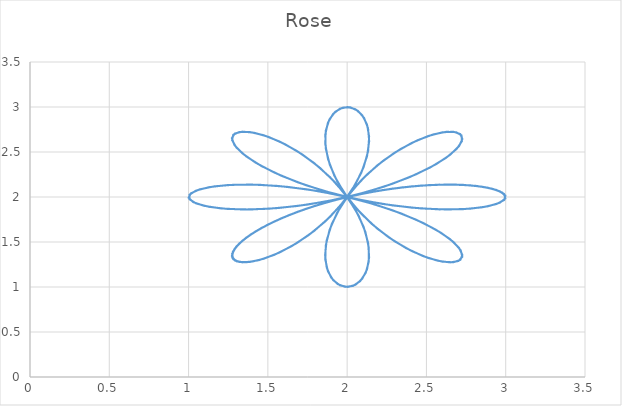
| Category | Series 0 |
|---|---|
| 3.0 | 2 |
| 2.9788417498233435 | 2.049 |
| 2.9164595255079897 | 2.092 |
| 2.8160679856132487 | 2.123 |
| 2.682818960388909 | 2.138 |
| 2.523505615634545 | 2.134 |
| 2.3461735849691836 | 2.107 |
| 2.1596624961211175 | 2.058 |
| 1.9731054589647656 | 1.989 |
| 1.7954165321851514 | 1.901 |
| 1.6347967930603848 | 1.8 |
| 1.4982883662804014 | 1.692 |
| 1.3914027043532338 | 1.584 |
| 1.3178447462840834 | 1.481 |
| 1.279348604054673 | 1.393 |
| 1.2756335099688503 | 1.325 |
| 1.3044813317975716 | 1.284 |
| 1.3619294874254928 | 1.274 |
| 1.44256602927608 | 1.298 |
| 1.5399074576674439 | 1.357 |
| 1.646834844431391 | 1.45 |
| 1.7560604093852499 | 1.575 |
| 1.860595002191198 | 1.726 |
| 1.9541871012836087 | 1.898 |
| 2.03170593515811 | 2.082 |
| 2.08944503044247 | 2.269 |
| 2.1253276607639418 | 2.451 |
| 2.139001984081751 | 2.619 |
| 2.131820716501302 | 2.764 |
| 2.1067075541202813 | 2.879 |
| 2.0679197592021223 | 2.958 |
| 2.0207229213061297 | 2.996 |
| 1.9709994748154158 | 2.993 |
| 1.924816752751114 | 2.947 |
| 1.8879829200140779 | 2.862 |
| 1.8656198968180455 | 2.742 |
| 1.8617813070289788 | 2.592 |
| 1.8791406337495438 | 2.422 |
| 1.9187703143213917 | 2.238 |
| 1.9800267375602116 | 2.05 |
| 2.060549378786958 | 1.868 |
| 2.156375044547313 | 1.699 |
| 2.2621608541937124 | 1.552 |
| 2.371502620615742 | 1.432 |
| 2.4773291449732904 | 1.344 |
| 2.5723479973804153 | 1.291 |
| 2.6495149294391815 | 1.273 |
| 2.7024973733976734 | 1.289 |
| 2.7261026366323735 | 1.335 |
| 2.716643394361806 | 1.407 |
| 2.6722167985068044 | 1.498 |
| 2.5928787295622704 | 1.602 |
| 2.480701101006426 | 1.711 |
| 2.3397072883763994 | 1.818 |
| 2.175688254787056 | 1.917 |
| 1.9959093168225424 | 2.002 |
| 1.8087242820455816 | 2.068 |
| 1.6231194701182894 | 2.113 |
| 1.4482145438069556 | 2.136 |
| 1.292749848263064 | 2.137 |
| 1.164590912628257 | 2.119 |
| 1.0702798451607412 | 2.085 |
| 1.0146606058642584 | 2.041 |
| 1.0006007360450402 | 1.992 |
| 1.028826331941241 | 1.943 |
| 1.097880225096576 | 1.902 |
| 1.2042058949359535 | 1.873 |
| 1.3423520464434504 | 1.861 |
| 1.5052855049605876 | 1.869 |
| 1.6847935586313398 | 1.9 |
| 1.8719515176077166 | 1.952 |
| 2.0576273866509456 | 2.025 |
| 2.2329934008943564 | 2.115 |
| 2.3900138831487436 | 2.217 |
| 2.5218804603069644 | 2.326 |
| 2.6233690255540574 | 2.434 |
| 2.6910977422672744 | 2.535 |
| 2.723671548486467 | 2.62 |
| 2.7217056542339124 | 2.684 |
| 2.6877279909877774 | 2.72 |
| 2.6259680102729512 | 2.725 |
| 2.54204617617705 | 2.695 |
| 2.4425845253040483 | 2.63 |
| 2.334763405678992 | 2.531 |
| 2.225852662638383 | 2.402 |
| 2.1227469227877513 | 2.246 |
| 2.0315341553092803 | 2.072 |
| 1.9571243974658106 | 1.887 |
| 1.9029615656229133 | 1.7 |
| 1.870835886103909 | 1.519 |
| 1.8608080116081882 | 1.355 |
| 1.8712487457192872 | 1.214 |
| 1.8989909288078193 | 1.105 |
| 1.9395829056490326 | 1.033 |
| 1.987626545398194 | 1.001 |
| 2.037177422214095 | 1.012 |
| 2.0821808255616134 | 1.064 |
| 2.1169149996536305 | 1.156 |
| 2.1364125536615663 | 1.281 |
| 2.1368323668857796 | 1.435 |
| 2.1157574495023326 | 1.609 |
| 2.072398913470873 | 1.794 |
| 2.0076921658248295 | 1.981 |
| 1.9242782847572402 | 2.162 |
| 1.8263708485724341 | 2.327 |
| 1.7195158003787585 | 2.47 |
| 1.6102587883904222 | 2.585 |
| 1.5057403919157892 | 2.667 |
| 1.4132443504519836 | 2.714 |
| 1.339727060079642 | 2.727 |
| 1.2913579868588185 | 2.706 |
| 1.2731001800646227 | 2.655 |
| 1.2883577731375273 | 2.579 |
| 1.3387133753958236 | 2.485 |
| 1.4237728265780878 | 2.38 |
| 1.5411282432755748 | 2.271 |
| 1.686443035119698 | 2.165 |
| 1.8536550577252398 | 2.068 |
| 2.0352867642138643 | 1.986 |
| 2.2228445709571187 | 1.923 |
| 2.4072840790657843 | 1.881 |
| 2.5795136382954236 | 1.862 |
| 2.730906264118577 | 1.865 |
| 2.853789277738519 | 1.886 |
| 2.941882275371771 | 1.921 |
| 2.9906570736594285 | 1.967 |
| 2.997597937400317 | 2.017 |
| 2.9623463885449217 | 2.064 |
| 2.8867218536017183 | 2.104 |
| 2.774616902554016 | 2.13 |
| 2.6317734050305557 | 2.139 |
| 2.4654531130316166 | 2.127 |
| 2.284022532295746 | 2.093 |
| 2.096477076159654 | 2.037 |
| 1.9119330918789044 | 1.961 |
| 1.7391181902708281 | 1.869 |
| 1.5858902842735838 | 1.765 |
| 1.4588138550940162 | 1.656 |
| 1.3628183356509211 | 1.548 |
| 1.3009583572317702 | 1.45 |
| 1.2742892673421156 | 1.368 |
| 1.2818641888029312 | 1.308 |
| 1.320851395390504 | 1.277 |
| 1.3867633923097822 | 1.278 |
| 1.4737822677292036 | 1.313 |
| 1.5751600458789534 | 1.384 |
| 1.6836682822951021 | 1.489 |
| 1.7920682729483695 | 1.623 |
| 1.8935721752693828 | 1.782 |
| 1.9822661225613998 | 1.959 |
| 2.053469000358273 | 2.145 |
| 2.104004778058102 | 2.332 |
| 2.1323718839228545 | 2.51 |
| 2.138799723484475 | 2.671 |
| 2.1251896547097866 | 2.807 |
| 2.09494509504956 | 2.91 |
| 2.0527024840178933 | 2.975 |
| 2.003981118486329 | 3 |
| 1.9547750222294076 | 2.982 |
| 1.9111136843222245 | 2.923 |
| 1.8786204728423779 | 2.825 |
| 1.8620976775537408 | 2.694 |
| 1.8651654486337261 | 2.537 |
| 1.8899784836098688 | 2.361 |
| 1.9370393852524164 | 2.175 |
| 2.005121477857342 | 1.988 |
| 2.09130691241506 | 1.809 |
| 2.1911385485418675 | 1.647 |
| 2.2988768332013554 | 1.508 |
| 2.4078461593929243 | 1.399 |
| 2.5108494056848363 | 1.322 |
| 2.6006248941505974 | 1.281 |
| 2.6703171424717516 | 1.275 |
| 2.7139317086699624 | 1.301 |
| 2.726745206040764 | 1.356 |
| 2.7056441576538726 | 1.435 |
| 2.6493706075060954 | 1.532 |
| 2.558658048927997 | 1.638 |
| 2.4362479227244744 | 1.747 |
| 2.286784264570713 | 1.853 |
| 2.1165915900419723 | 1.947 |
| 1.9333483309738688 | 2.026 |
| 1.745674630166459 | 2.086 |
| 1.5626586590554854 | 2.123 |
| 1.3933495110300678 | 2.139 |
| 1.2462468983617265 | 2.133 |
| 1.1288182057950513 | 2.109 |
| 1.0470719056857907 | 2.071 |
| 1.0052130109847992 | 2.025 |
| 1.0054013363657277 | 1.975 |
| 1.0476271550390264 | 1.928 |
| 1.1297117589968426 | 1.89 |
| 1.2474328888553095 | 1.867 |
| 1.3947674599638131 | 1.861 |
| 1.5642369377673742 | 1.877 |
| 1.7473345424222666 | 1.915 |
| 1.9350085694835202 | 1.974 |
| 2.1181727999708397 | 2.054 |
| 2.2882134413531983 | 2.148 |
| 2.4374623827844513 | 2.254 |
| 2.559608739189864 | 2.363 |
| 2.650024561128918 | 2.469 |
| 2.705985956646253 | 2.565 |
| 2.7267773730032103 | 2.644 |
| 2.7136740160388784 | 2.699 |
| 2.6698048942034407 | 2.725 |
| 2.5999062976628715 | 2.719 |
| 2.509982207181079 | 2.677 |
| 2.4068937600182503 | 2.6 |
| 2.2979041341000426 | 2.491 |
| 2.19020778793304 | 2.352 |
| 2.090473756384629 | 2.189 |
| 2.0044316088097482 | 2.011 |
| 1.93652579902407 | 1.824 |
| 1.8896596602104347 | 1.638 |
| 1.8650445053581628 | 1.462 |
| 1.8621625503357546 | 1.304 |
| 1.878845106148066 | 1.174 |
| 1.9114601457249327 | 1.076 |
| 1.9551963990848507 | 1.018 |
| 2.0044250045194696 | 1 |
| 2.053114826246333 | 1.025 |
| 2.0952741486427047 | 1.091 |
| 2.1253897865474385 | 1.194 |
| 2.138834814760623 | 1.33 |
| 2.132218107540524 | 1.492 |
| 2.103652566189423 | 1.67 |
| 2.0529240689194963 | 1.857 |
| 1.981549479258219 | 2.043 |
| 1.8927191025504198 | 2.22 |
| 1.791126342609032 | 2.378 |
| 1.6826945204962682 | 2.512 |
| 1.5742174220880054 | 2.616 |
| 1.472935725108101 | 2.687 |
| 1.3860756675848183 | 2.722 |
| 1.3203788912992769 | 2.723 |
| 1.2816531608451829 | 2.692 |
| 1.2743725688048915 | 2.632 |
| 1.3013529533797055 | 2.549 |
| 1.3635237515894907 | 2.451 |
| 1.4598116649787993 | 2.343 |
| 1.587144685758403 | 2.234 |
| 1.7405776413058645 | 2.131 |
| 1.9135329213231864 | 2.038 |
| 2.098142919233144 | 1.962 |
| 2.2856743904200125 | 1.906 |
| 2.4670097982996197 | 1.873 |
| 2.633157104860346 | 1.861 |
| 2.7757575915703034 | 1.87 |
| 2.887561288005797 | 1.896 |
| 2.962841442695267 | 1.936 |
| 2.997723081546011 | 1.984 |
| 2.9904058433455862 | 2.033 |
| 2.941267643804487 | 2.079 |
| 2.8528429086214113 | 2.115 |
| 2.7296766900808707 | 2.136 |
| 2.5780634748640114 | 2.138 |
| 2.405686442204082 | 2.118 |
| 2.2211789139338496 | 2.077 |
| 2.0336343840467737 | 2.014 |
| 1.8520945405607079 | 1.932 |
| 1.6850459125027917 | 1.835 |
| 1.5399551172020316 | 1.728 |
| 1.4228701913957853 | 1.619 |
| 1.3381113209079727 | 1.514 |
| 1.2880686983798704 | 1.42 |
| 1.2731185845985409 | 1.345 |
| 1.2916613399308154 | 1.294 |
| 1.340277681768002 | 1.273 |
| 1.4139921770536583 | 1.286 |